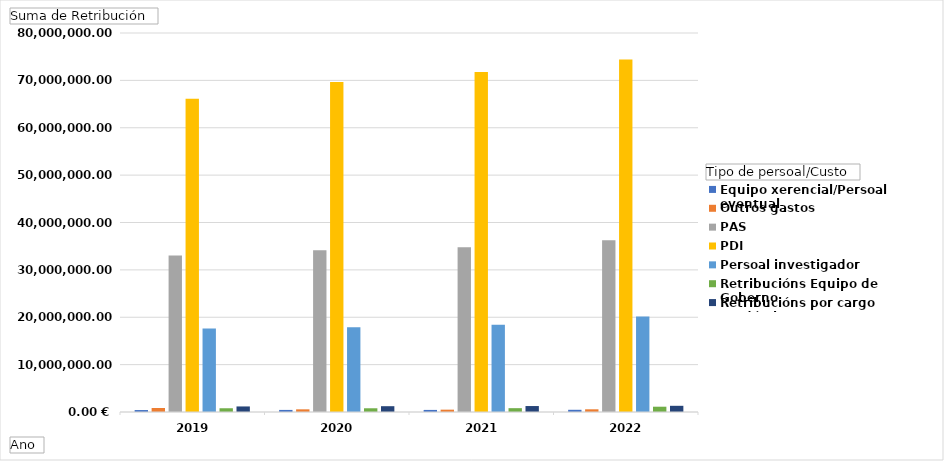
| Category | Equipo xerencial/Persoal eventual | Outros gastos | PAS | PDI | Persoal investigador | Retribucións Equipo de Goberno | Retribucións por cargo académico |
|---|---|---|---|---|---|---|---|
| 2019 | 412263.66 | 846632.88 | 33041828.83 | 66138863.12 | 17600789.84 | 790084.91 | 1172230.16 |
| 2020 | 440101.25 | 563841.64 | 34136555.31 | 69666572.955 | 17900266.91 | 787586.41 | 1225436.59 |
| 2021 | 439834.44 | 493929.61 | 34770547.71 | 71760878.7 | 18438960.2 | 808254.57 | 1258711.63 |
| 2022 | 466036.4 | 570907.36 | 36267915.09 | 74385998.07 | 20155107.82 | 1118036.43 | 1307798.55 |